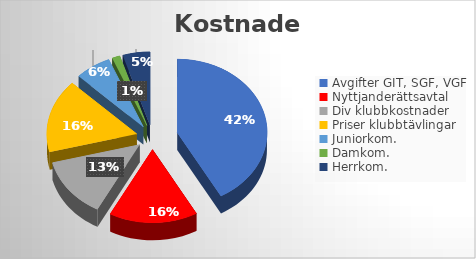
| Category | Series 0 |
|---|---|
| Avgifter GIT, SGF, VGF | 116380 |
| Nyttjanderättsavtal | 44200 |
| Div klubbkostnader | 36780 |
| Priser klubbtävlingar | 45000 |
| Juniorkom. | 18000 |
| Damkom. | 3900 |
| Herrkom. | 13600 |